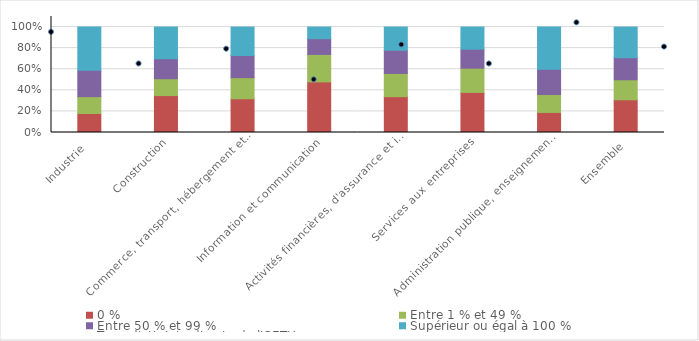
| Category | 0 % | Entre 1 % et 49 % | Entre 50 % et 99 % | Supérieur ou égal à 100 % |
|---|---|---|---|---|
| Industrie  | 18 | 16 | 25 | 41 |
| Construction | 35 | 16 | 19 | 30 |
| Commerce, transport, hébergement et restauration | 32 | 20 | 21 | 27 |
| Information et communication | 48 | 26 | 15 | 11 |
| Activités financières, d'assurance et immobilières | 34 | 22 | 22 | 22 |
| Services aux entreprises | 38 | 23 | 18 | 21 |
| Administration publique, enseignement, santé humaine et action sociale* | 19 | 17 | 24 | 40 |
| Ensemble | 31 | 19 | 21 | 29 |